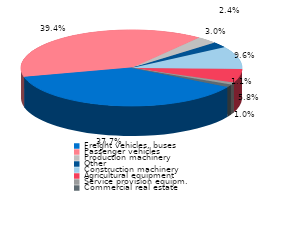
| Category | Series 0 |
|---|---|
| Freight vehicles, buses | 0.377 |
| Passenger vehicles | 0.394 |
| Production machinery | 0.03 |
| Other | 0.024 |
| Construction machinery | 0.096 |
| Agricultural equipment | 0.058 |
| Service provision equipm. | 0.01 |
| Commercial real estate | 0.011 |